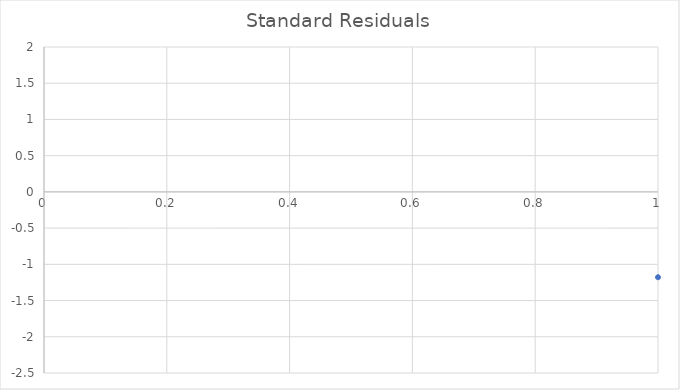
| Category | Standard Residuals |
|---|---|
| 0 | -1.178 |
| 1 | 0.485 |
| 2 | -1.385 |
| 3 | -1.037 |
| 4 | 0.811 |
| 5 | -0.062 |
| 6 | -1.128 |
| 7 | -0.903 |
| 8 | -0.741 |
| 9 | -1.58 |
| 10 | -1.671 |
| 11 | 1.745 |
| 12 | 0.768 |
| 13 | 0.289 |
| 14 | -0.292 |
| 15 | 0.003 |
| 16 | -0.214 |
| 17 | 0.47 |
| 18 | 0.014 |
| 19 | 0.58 |
| 20 | 0.012 |
| 21 | 0.09 |
| 22 | 0.273 |
| 23 | -0.249 |
| 24 | 1.487 |
| 25 | 1.728 |
| 26 | -0.895 |
| 27 | -2.128 |
| 28 | 0.655 |
| 29 | 1.163 |
| 30 | 1.355 |
| 31 | 1.588 |
| 32 | -0.024 |
| 33 | -0.366 |
| 34 | -0.275 |
| 35 | 0.612 |